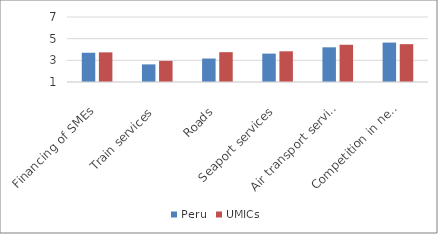
| Category | Peru | UMICs |
|---|---|---|
| Financing of SMEs | 3.7 | 3.737 |
| Train services | 2.626 | 2.95 |
| Roads | 3.167 | 3.753 |
| Seaport services | 3.619 | 3.834 |
| Air transport services | 4.202 | 4.437 |
| Competition in network services | 4.638 | 4.494 |